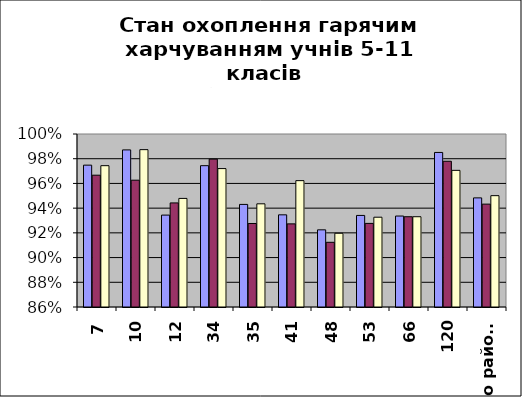
| Category | Series 0 | Series 1 | Series 2 |
|---|---|---|---|
| 7 | 0.975 | 0.967 | 0.974 |
| 10 | 0.987 | 0.963 | 0.987 |
| 12 | 0.934 | 0.944 | 0.948 |
| 34 | 0.974 | 0.98 | 0.972 |
| 35 | 0.943 | 0.928 | 0.944 |
| 41 | 0.935 | 0.927 | 0.962 |
| 48 | 0.922 | 0.912 | 0.92 |
| 53 | 0.934 | 0.928 | 0.933 |
| 66 | 0.934 | 0.933 | 0.933 |
| 120 | 0.985 | 0.978 | 0.971 |
| по району | 0.948 | 0.943 | 0.95 |